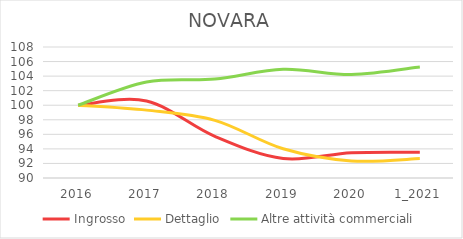
| Category | Ingrosso | Dettaglio | Altre attività commerciali |
|---|---|---|---|
| 2016 | 100 | 100 | 100 |
| 2017 | 100.581 | 99.327 | 103.186 |
| 2018 | 95.728 | 97.924 | 103.597 |
| 2019 | 92.686 | 94.016 | 104.933 |
| 2020 | 93.472 | 92.352 | 104.214 |
| 1_2021 | 93.541 | 92.67 | 105.242 |